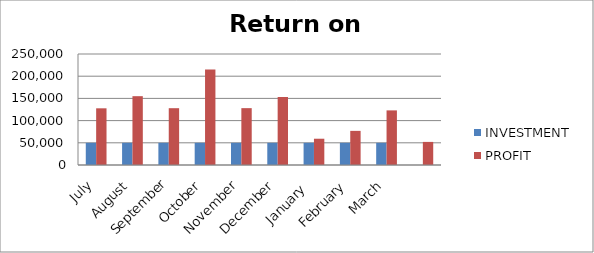
| Category | INVESTMENT  | PROFIT |
|---|---|---|
| July | 50000 | 127679 |
| August | 50000 | 154994 |
| September | 50000 | 127951 |
| October | 50000 | 214845 |
| November | 50000 | 128050 |
| December | 50000 | 153141 |
| January  | 50000 | 59177 |
| February | 50000 | 76860 |
| March | 50000 | 123000 |